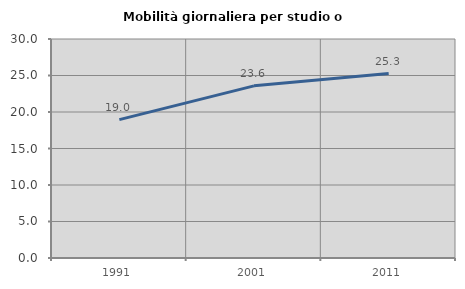
| Category | Mobilità giornaliera per studio o lavoro |
|---|---|
| 1991.0 | 18.952 |
| 2001.0 | 23.581 |
| 2011.0 | 25.269 |